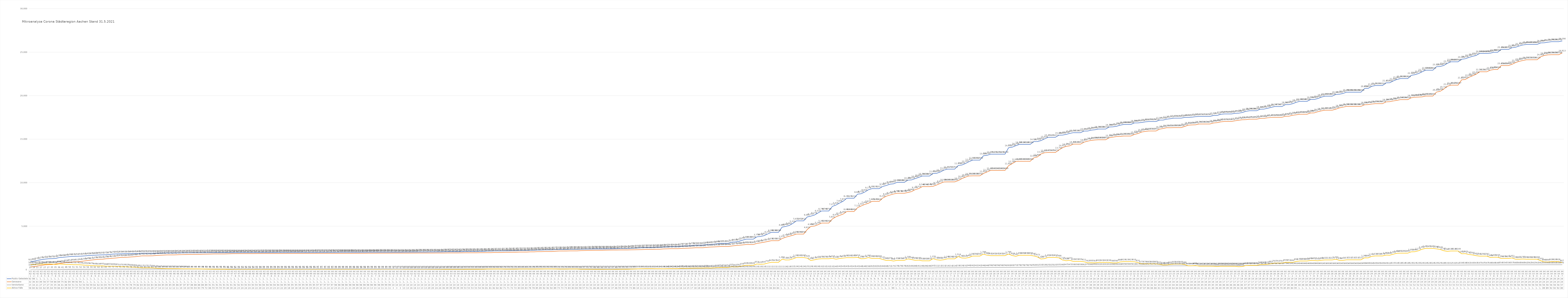
| Category | Positiv Getestete | Genesene | Verstorbene | Aktive Fälle |
|---|---|---|---|---|
| 3/31/20 | 922 | 322 | 15 | 585 |
| 4/1/20 | 980 | 364 | 16 | 600 |
| 4/2/20 | 1081 | 435 | 21 | 625 |
| 4/3/20 | 1155 | 494 | 27 | 634 |
| 4/4/20 | 1213 | 560 | 27 | 626 |
| 4/5/20 | 1259 | 578 | 27 | 654 |
| 4/6/20 | 1272 | 595 | 35 | 642 |
| 4/7/20 | 1295 | 662 | 35 | 598 |
| 4/8/20 | 1399 | 699 | 36 | 664 |
| 4/9/20 | 1426 | 755 | 41 | 630 |
| 4/10/20 | 1465 | 826 | 48 | 591 |
| 4/11/20 | 1508 | 854 | 50 | 604 |
| 4/12/20 | 1532 | 906 | 51 | 575 |
| 4/13/20 | 1547 | 922 | 51 | 574 |
| 4/14/20 | 1557 | 949 | 52 | 556 |
| 4/15/20 | 1583 | 1009 | 54 | 520 |
| 4/16/20 | 1623 | 1058 | 56 | 509 |
| 4/17/20 | 1650 | 1112 | 59 | 479 |
| 4/18/20 | 1669 | 1159 | 62 | 448 |
| 4/19/20 | 1693 | 1195 | 62 | 436 |
| 4/20/20 | 1707 | 1201 | 63 | 443 |
| 4/21/20 | 1719 | 1256 | 65 | 398 |
| 4/22/20 | 1754 | 1281 | 70 | 403 |
| 4/23/20 | 1797 | 1324 | 73 | 400 |
| 4/24/20 | 1812 | 1357 | 74 | 381 |
| 4/25/20 | 1824 | 1412 | 75 | 337 |
| 4/26/20 | 1835 | 1420 | 76 | 339 |
| 4/27/20 | 1839 | 1435 | 76 | 328 |
| 4/28/20 | 1845 | 1467 | 78 | 300 |
| 4/29/20 | 1853 | 1490 | 79 | 284 |
| 4/30/20 | 1866 | 1535 | 82 | 249 |
| 5/1/20 | 1891 | 1591 | 83 | 217 |
| 5/2/20 | 1891 | 1591 | 83 | 217 |
| 5/3/20 | 1891 | 1591 | 83 | 217 |
| 5/4/20 | 1885 | 1598 | 83 | 204 |
| 5/5/20 | 1890 | 1636 | 84 | 170 |
| 5/6/20 | 1895 | 1664 | 84 | 147 |
| 5/7/20 | 1903 | 1682 | 85 | 136 |
| 5/8/20 | 1909 | 1702 | 85 | 122 |
| 5/9/20 | 1909 | 1702 | 85 | 122 |
| 5/10/20 | 1909 | 1702 | 85 | 122 |
| 5/11/20 | 1924 | 1721 | 86 | 117 |
| 5/12/20 | 1929 | 1736 | 87 | 106 |
| 5/13/20 | 1934 | 1743 | 87 | 104 |
| 5/14/20 | 1941 | 1753 | 87 | 101 |
| 5/15/20 | 1945 | 1764 | 88 | 93 |
| 5/16/20 | 1945 | 1764 | 88 | 93 |
| 5/17/20 | 1945 | 1764 | 88 | 93 |
| 5/18/20 | 1951 | 1784 | 88 | 79 |
| 5/19/20 | 1952 | 1791 | 89 | 72 |
| 5/20/20 | 1958 | 1801 | 91 | 66 |
| 5/21/20 | 1960 | 1814 | 91 | 55 |
| 5/22/20 | 1960 | 1814 | 91 | 55 |
| 5/23/20 | 1960 | 1814 | 91 | 55 |
| 5/24/20 | 1960 | 1814 | 91 | 55 |
| 5/25/20 | 1960 | 1829 | 91 | 40 |
| 5/26/20 | 1960 | 1839 | 91 | 30 |
| 5/27/20 | 1962 | 1846 | 92 | 24 |
| 5/28/20 | 1964 | 1849 | 92 | 23 |
| 5/29/20 | 1967 | 1850 | 93 | 24 |
| 5/30/20 | 1967 | 1850 | 93 | 24 |
| 5/31/20 | 1967 | 1850 | 93 | 24 |
| 6/1/20 | 1967 | 1850 | 93 | 24 |
| 6/2/20 | 1971 | 1856 | 93 | 22 |
| 6/3/20 | 1972 | 1858 | 94 | 20 |
| 6/4/20 | 1975 | 1859 | 94 | 22 |
| 6/5/20 | 1976 | 1859 | 94 | 23 |
| 6/6/20 | 1976 | 1859 | 94 | 23 |
| 6/7/20 | 1976 | 1859 | 94 | 23 |
| 6/8/20 | 1979 | 1862 | 94 | 23 |
| 6/9/20 | 1979 | 1863 | 94 | 22 |
| 6/10/20 | 1980 | 1865 | 95 | 20 |
| 6/11/20 | 1982 | 1869 | 95 | 18 |
| 6/12/20 | 1982 | 1869 | 95 | 18 |
| 6/13/20 | 1982 | 1869 | 95 | 18 |
| 6/14/20 | 1982 | 1869 | 95 | 18 |
| 6/15/20 | 1982 | 1871 | 95 | 16 |
| 6/16/20 | 1982 | 1871 | 95 | 16 |
| 6/17/20 | 1985 | 1871 | 95 | 19 |
| 6/18/20 | 1985 | 1871 | 95 | 19 |
| 6/19/20 | 1991 | 1873 | 97 | 21 |
| 6/20/20 | 1991 | 1873 | 97 | 21 |
| 6/21/20 | 1991 | 1873 | 97 | 21 |
| 6/22/20 | 1994 | 1875 | 97 | 22 |
| 6/23/20 | 1994 | 1875 | 97 | 22 |
| 6/24/20 | 1997 | 1876 | 98 | 23 |
| 6/25/20 | 1999 | 1880 | 98 | 21 |
| 6/26/20 | 1999 | 1880 | 98 | 21 |
| 6/27/20 | 1999 | 1880 | 98 | 21 |
| 6/28/20 | 1999 | 1880 | 98 | 21 |
| 6/29/20 | 2001 | 1883 | 98 | 20 |
| 6/30/20 | 2001 | 1883 | 98 | 20 |
| 7/1/20 | 2004 | 1890 | 98 | 16 |
| 7/2/20 | 2004 | 1890 | 98 | 16 |
| 7/3/20 | 2009 | 1898 | 98 | 13 |
| 7/4/20 | 2009 | 1898 | 98 | 13 |
| 7/5/20 | 2009 | 1898 | 98 | 13 |
| 7/6/20 | 2010 | 1900 | 98 | 12 |
| 7/7/20 | 2010 | 1900 | 99 | 11 |
| 7/8/20 | 2010 | 1900 | 99 | 11 |
| 7/9/20 | 2010 | 1900 | 99 | 11 |
| 7/10/20 | 2011 | 1908 | 100 | 3 |
| 7/11/20 | 2011 | 1908 | 100 | 3 |
| 7/12/20 | 2011 | 1908 | 100 | 3 |
| 7/13/20 | 2021 | 1908 | 100 | 13 |
| 7/14/20 | 2021 | 1908 | 100 | 13 |
| 7/15/20 | 2025 | 1909 | 100 | 16 |
| 7/16/20 | 2025 | 1909 | 100 | 16 |
| 7/17/20 | 2030 | 1917 | 100 | 13 |
| 7/18/20 | 2030 | 1917 | 100 | 13 |
| 7/19/20 | 2030 | 1917 | 100 | 13 |
| 7/20/20 | 2037 | 1917 | 100 | 20 |
| 7/21/20 | 2037 | 1917 | 100 | 20 |
| 7/22/20 | 2044 | 1920 | 100 | 24 |
| 7/23/20 | 2044 | 1920 | 100 | 24 |
| 7/24/20 | 2058 | 1922 | 100 | 36 |
| 7/25/20 | 2067 | 1928 | 100 | 39 |
| 7/26/20 | 2067 | 1928 | 100 | 39 |
| 7/27/20 | 2067 | 1928 | 100 | 39 |
| 7/28/20 | 2067 | 1928 | 100 | 39 |
| 7/29/20 | 2076 | 1937 | 100 | 39 |
| 7/30/20 | 2095 | 1942 | 100 | 53 |
| 7/31/20 | 2095 | 1942 | 100 | 53 |
| 8/1/20 | 2095 | 1942 | 100 | 53 |
| 8/2/20 | 2095 | 1942 | 100 | 53 |
| 8/3/20 | 2108 | 1954 | 100 | 54 |
| 8/4/20 | 2108 | 1954 | 100 | 54 |
| 8/5/20 | 2139 | 1958 | 100 | 81 |
| 8/6/20 | 2139 | 1958 | 100 | 81 |
| 8/7/20 | 2157 | 1975 | 100 | 82 |
| 8/8/20 | 2157 | 1975 | 100 | 82 |
| 8/9/20 | 2157 | 1975 | 100 | 82 |
| 8/10/20 | 2170 | 1999 | 100 | 71 |
| 8/11/20 | 2170 | 1999 | 100 | 71 |
| 8/12/20 | 2181 | 2008 | 101 | 72 |
| 8/13/20 | 2181 | 2008 | 101 | 72 |
| 8/14/20 | 2212 | 2028 | 101 | 83 |
| 8/15/20 | 2212 | 2028 | 101 | 83 |
| 8/16/20 | 2212 | 2028 | 101 | 83 |
| 8/17/20 | 2232 | 2053 | 101 | 78 |
| 8/18/20 | 2232 | 2053 | 101 | 78 |
| 8/19/20 | 2261 | 2074 | 102 | 85 |
| 8/20/20 | 2261 | 2074 | 102 | 85 |
| 8/21/20 | 2281 | 2087 | 102 | 92 |
| 8/22/20 | 2281 | 2087 | 102 | 92 |
| 8/23/20 | 2281 | 2087 | 102 | 92 |
| 8/24/20 | 2311 | 2120 | 102 | 89 |
| 8/25/20 | 2324 | 2149 | 102 | 73 |
| 8/26/20 | 2324 | 2149 | 102 | 73 |
| 8/27/20 | 2324 | 2149 | 102 | 73 |
| 8/28/20 | 2348 | 2163 | 102 | 83 |
| 8/29/20 | 2348 | 2163 | 102 | 83 |
| 8/30/20 | 2348 | 2163 | 102 | 83 |
| 8/31/20 | 2353 | 2193 | 102 | 58 |
| 9/1/20 | 2363 | 2203 | 103 | 57 |
| 9/2/20 | 2370 | 2216 | 103 | 51 |
| 9/3/20 | 2378 | 2224 | 103 | 51 |
| 9/4/20 | 2384 | 2235 | 103 | 46 |
| 9/5/20 | 2384 | 2235 | 103 | 46 |
| 9/6/20 | 2384 | 2235 | 103 | 46 |
| 9/7/20 | 2389 | 2247 | 103 | 39 |
| 9/8/20 | 2393 | 2258 | 103 | 32 |
| 9/9/20 | 2400 | 2260 | 103 | 37 |
| 9/10/20 | 2412 | 2263 | 103 | 46 |
| 9/11/20 | 2429 | 2271 | 103 | 55 |
| 9/12/20 | 2429 | 2271 | 103 | 55 |
| 9/13/20 | 2429 | 2271 | 103 | 55 |
| 9/14/20 | 2459 | 2283 | 103 | 73 |
| 9/15/20 | 2477 | 2288 | 103 | 86 |
| 9/16/20 | 2503 | 2297 | 103 | 103 |
| 9/17/20 | 2522 | 2309 | 103 | 110 |
| 9/18/20 | 2550 | 2326 | 103 | 121 |
| 9/19/20 | 2550 | 2326 | 103 | 121 |
| 9/20/20 | 2550 | 2326 | 103 | 121 |
| 9/21/20 | 2568 | 2350 | 104 | 114 |
| 9/22/20 | 2568 | 2350 | 104 | 114 |
| 9/23/20 | 2600 | 2387 | 104 | 109 |
| 9/24/20 | 2621 | 2398 | 104 | 119 |
| 9/25/20 | 2643 | 2415 | 104 | 124 |
| 9/26/20 | 2643 | 2415 | 104 | 124 |
| 9/27/20 | 2643 | 2415 | 104 | 124 |
| 9/28/20 | 2707 | 2442 | 105 | 160 |
| 9/29/20 | 2718 | 2464 | 105 | 149 |
| 9/30/20 | 2734 | 2476 | 106 | 152 |
| 10/1/20 | 2776 | 2495 | 106 | 175 |
| 10/2/20 | 2812 | 2524 | 106 | 182 |
| 10/3/20 | 2812 | 2524 | 106 | 182 |
| 10/4/20 | 2812 | 2524 | 106 | 182 |
| 10/5/20 | 2883 | 2571 | 106 | 206 |
| 10/6/20 | 2891 | 2601 | 107 | 183 |
| 10/7/20 | 2936 | 2617 | 107 | 212 |
| 10/8/20 | 2988 | 2638 | 107 | 243 |
| 10/9/20 | 3027 | 2664 | 109 | 254 |
| 10/10/20 | 3027 | 2664 | 109 | 254 |
| 10/11/20 | 3027 | 2664 | 109 | 254 |
| 10/12/20 | 3167 | 2723 | 109 | 335 |
| 10/13/20 | 3188 | 2772 | 109 | 307 |
| 10/14/20 | 3257 | 2806 | 109 | 342 |
| 10/15/20 | 3393 | 2845 | 109 | 439 |
| 10/16/20 | 3509 | 2891 | 109 | 509 |
| 10/17/20 | 3509 | 2891 | 109 | 509 |
| 10/18/20 | 3509 | 2891 | 109 | 509 |
| 10/19/20 | 3778 | 3016 | 110 | 652 |
| 10/20/20 | 3816 | 3084 | 110 | 622 |
| 10/21/20 | 3912 | 3157 | 110 | 645 |
| 10/22/20 | 4103 | 3237 | 111 | 755 |
| 10/23/20 | 4288 | 3330 | 111 | 847 |
| 10/24/20 | 4288 | 3330 | 111 | 847 |
| 10/25/20 | 4288 | 3330 | 111 | 847 |
| 10/26/20 | 4889 | 3574 | 111 | 1204 |
| 10/27/20 | 4969 | 3734 | 116 | 1119 |
| 10/28/20 | 5082 | 3840 | 119 | 1123 |
| 10/29/20 | 5316 | 3953 | 122 | 1241 |
| 10/30/20 | 5612 | 4093 | 124 | 1395 |
| 10/31/20 | 5612 | 4093 | 124 | 1395 |
| 11/1/20 | 5612 | 4093 | 124 | 1395 |
| 11/2/20 | 6061 | 4610 | 125 | 1326 |
| 11/3/20 | 6153 | 4966 | 129 | 1058 |
| 11/4/20 | 6278 | 5013 | 130 | 1135 |
| 11/5/20 | 6519 | 5166 | 130 | 1223 |
| 11/6/20 | 6748 | 5360 | 132 | 1256 |
| 11/7/20 | 6748 | 5360 | 132 | 1256 |
| 11/8/20 | 6748 | 5360 | 132 | 1256 |
| 11/9/20 | 7273 | 5831 | 132 | 1310 |
| 11/10/20 | 7426 | 6076 | 140 | 1210 |
| 11/11/20 | 7658 | 6237 | 142 | 1279 |
| 11/12/20 | 7871 | 6394 | 143 | 1334 |
| 11/13/20 | 8211 | 6683 | 143 | 1385 |
| 11/14/20 | 8211 | 6683 | 143 | 1385 |
| 11/15/20 | 8211 | 6683 | 143 | 1385 |
| 11/16/20 | 8681 | 7124 | 143 | 1414 |
| 11/17/20 | 8728 | 7322 | 148 | 1258 |
| 11/18/20 | 8920 | 7498 | 148 | 1274 |
| 11/19/20 | 9179 | 7631 | 156 | 1392 |
| 11/20/20 | 9311 | 7849 | 162 | 1300 |
| 11/21/20 | 9311 | 7849 | 162 | 1300 |
| 11/22/20 | 9311 | 7849 | 162 | 1300 |
| 11/23/20 | 9565 | 8230 | 164 | 1171 |
| 11/24/20 | 9676 | 8447 | 168 | 1061 |
| 11/25/20 | 9827 | 8576 | 172 | 1079 |
| 11/26/20 | 9867 | 8698 | 175 | 994 |
| 11/27/20 | 10038 | 8786 | 178 | 1074 |
| 11/28/20 | 10038 | 8786 | 178 | 1074 |
| 11/29/20 | 10038 | 8786 | 178 | 1074 |
| 11/30/20 | 10289 | 8868 | 182 | 1239 |
| 12/1/20 | 10316 | 8968 | 184 | 1164 |
| 12/2/20 | 10460 | 9194 | 188 | 1078 |
| 12/3/20 | 10605 | 9314 | 191 | 1100 |
| 12/4/20 | 10764 | 9548 | 196 | 1020 |
| 12/5/20 | 10764 | 9548 | 196 | 1020 |
| 12/6/20 | 10764 | 9548 | 196 | 1020 |
| 12/7/20 | 11053 | 9586 | 197 | 1270 |
| 12/8/20 | 11080 | 9730 | 211 | 1139 |
| 12/9/20 | 11222 | 9915 | 213 | 1094 |
| 12/10/20 | 11442 | 10086 | 213 | 1143 |
| 12/11/20 | 11557 | 10095 | 214 | 1248 |
| 12/12/20 | 11557 | 10095 | 214 | 1248 |
| 12/13/20 | 11557 | 10095 | 214 | 1248 |
| 12/14/20 | 11970 | 10237 | 219 | 1514 |
| 12/15/20 | 12025 | 10461 | 219 | 1345 |
| 12/16/20 | 12197 | 10640 | 232 | 1325 |
| 12/17/20 | 12415 | 10773 | 240 | 1402 |
| 12/18/20 | 12592 | 10783 | 242 | 1567 |
| 12/19/20 | 12592 | 10783 | 242 | 1567 |
| 12/20/20 | 12592 | 10783 | 242 | 1567 |
| 12/21/20 | 13089 | 11054 | 246 | 1789 |
| 12/22/20 | 13144 | 11232 | 246 | 1666 |
| 12/23/20 | 13276 | 11409 | 256 | 1611 |
| 12/24/20 | 13276 | 11409 | 256 | 1611 |
| 12/25/20 | 13276 | 11409 | 256 | 1611 |
| 12/26/20 | 13276 | 11409 | 256 | 1611 |
| 12/27/20 | 13276 | 11409 | 256 | 1611 |
| 12/28/20 | 14012 | 11950 | 263 | 1799 |
| 12/29/20 | 14078 | 12189 | 265 | 1624 |
| 12/30/20 | 14248 | 12435 | 272 | 1541 |
| 12/31/20 | 14395 | 12460 | 276 | 1659 |
| 1/1/21 | 14395 | 12460 | 276 | 1659 |
| 1/2/21 | 14395 | 12460 | 276 | 1659 |
| 1/3/21 | 14395 | 12460 | 276 | 1659 |
| 1/4/21 | 14721 | 12848 | 292 | 1581 |
| 1/5/21 | 14723 | 12949 | 301 | 1473 |
| 1/6/21 | 14832 | 13293 | 310 | 1229 |
| 1/7/21 | 15028 | 13437 | 319 | 1272 |
| 1/8/21 | 15211 | 13473 | 325 | 1413 |
| 1/9/21 | 15211 | 13473 | 325 | 1413 |
| 1/10/21 | 15211 | 13473 | 325 | 1413 |
| 1/11/21 | 15460 | 13759 | 335 | 1366 |
| 1/12/21 | 15469 | 14015 | 340 | 1114 |
| 1/13/21 | 15548 | 14173 | 347 | 1028 |
| 1/14/21 | 15657 | 14233 | 347 | 1077 |
| 1/15/21 | 15745 | 14431 | 359 | 955 |
| 1/16/21 | 15745 | 14431 | 359 | 955 |
| 1/17/21 | 15745 | 14431 | 359 | 955 |
| 1/18/21 | 15931 | 14657 | 362 | 912 |
| 1/19/21 | 15933 | 14772 | 370 | 791 |
| 1/20/21 | 16037 | 14857 | 380 | 800 |
| 1/21/21 | 16081 | 14908 | 390 | 783 |
| 1/22/21 | 16164 | 14930 | 393 | 841 |
| 1/23/21 | 16164 | 14930 | 393 | 841 |
| 1/24/21 | 16164 | 14930 | 393 | 841 |
| 1/25/21 | 16399 | 15168 | 393 | 838 |
| 1/26/21 | 16415 | 15229 | 398 | 788 |
| 1/27/21 | 16478 | 15299 | 399 | 780 |
| 1/28/21 | 16602 | 15315 | 399 | 888 |
| 1/29/21 | 16688 | 15360 | 405 | 923 |
| 1/30/21 | 16688 | 15360 | 405 | 923 |
| 1/31/21 | 16688 | 15360 | 405 | 923 |
| 2/1/21 | 16866 | 15540 | 416 | 910 |
| 2/2/21 | 16871 | 15644 | 417 | 810 |
| 2/3/21 | 16914 | 15817 | 420 | 677 |
| 2/4/21 | 16984 | 15886 | 420 | 678 |
| 2/5/21 | 17029 | 15937 | 427 | 665 |
| 2/6/21 | 17029 | 15937 | 427 | 665 |
| 2/7/21 | 17029 | 15937 | 427 | 665 |
| 2/8/21 | 17191 | 16150 | 430 | 611 |
| 2/9/21 | 17198 | 16225 | 435 | 538 |
| 2/10/21 | 17301 | 16316 | 437 | 548 |
| 2/11/21 | 17352 | 16314 | 437 | 601 |
| 2/12/21 | 17416 | 16328 | 443 | 645 |
| 2/13/21 | 17416 | 16328 | 443 | 645 |
| 2/14/21 | 17416 | 16328 | 443 | 645 |
| 2/15/21 | 17499 | 16463 | 447 | 589 |
| 2/16/21 | 17502 | 16612 | 447 | 443 |
| 2/17/21 | 17530 | 16635 | 448 | 447 |
| 2/18/21 | 17582 | 16651 | 448 | 483 |
| 2/19/21 | 17611 | 16744 | 455 | 412 |
| 2/20/21 | 17611 | 16744 | 455 | 412 |
| 2/21/21 | 17611 | 16744 | 455 | 412 |
| 2/22/21 | 17611 | 16744 | 455 | 412 |
| 2/23/21 | 17720 | 16859 | 455 | 406 |
| 2/24/21 | 17722 | 16899 | 457 | 366 |
| 2/25/21 | 17858 | 16987 | 465 | 406 |
| 2/26/21 | 17896 | 17033 | 465 | 398 |
| 2/27/21 | 17896 | 17033 | 465 | 398 |
| 2/28/21 | 17896 | 17033 | 465 | 398 |
| 3/1/21 | 17971 | 17110 | 466 | 395 |
| 3/2/21 | 17984 | 17178 | 466 | 340 |
| 3/3/21 | 18062 | 17228 | 468 | 366 |
| 3/4/21 | 18194 | 17244 | 470 | 480 |
| 3/5/21 | 18266 | 17295 | 470 | 501 |
| 3/6/21 | 18266 | 17295 | 470 | 501 |
| 3/7/21 | 18266 | 17295 | 470 | 501 |
| 3/8/21 | 18445 | 17383 | 473 | 589 |
| 3/9/21 | 18451 | 17388 | 474 | 589 |
| 3/10/21 | 18548 | 17451 | 474 | 623 |
| 3/11/21 | 18651 | 17493 | 475 | 683 |
| 3/12/21 | 18747 | 17508 | 476 | 763 |
| 3/13/21 | 18747 | 17508 | 476 | 763 |
| 3/14/21 | 18747 | 17508 | 476 | 763 |
| 3/15/21 | 18967 | 17633 | 479 | 855 |
| 3/16/21 | 18970 | 17638 | 481 | 851 |
| 3/17/21 | 19075 | 17749 | 482 | 844 |
| 3/18/21 | 19232 | 17800 | 482 | 950 |
| 3/19/21 | 19348 | 17864 | 484 | 1000 |
| 3/20/21 | 19348 | 17864 | 484 | 1000 |
| 3/21/21 | 19348 | 17864 | 484 | 1000 |
| 3/22/21 | 19559 | 18009 | 486 | 1064 |
| 3/23/21 | 19563 | 18017 | 489 | 1057 |
| 3/24/21 | 19663 | 18151 | 490 | 1022 |
| 3/25/21 | 19832 | 18252 | 491 | 1089 |
| 3/26/21 | 19939 | 18325 | 493 | 1121 |
| 3/27/21 | 19939 | 18325 | 493 | 1121 |
| 3/28/21 | 19939 | 18325 | 493 | 1121 |
| 3/29/21 | 20141 | 18444 | 493 | 1204 |
| 3/30/21 | 20162 | 18593 | 495 | 1074 |
| 3/31/21 | 20247 | 18675 | 495 | 1077 |
| 4/1/21 | 20398 | 18766 | 495 | 1137 |
| 4/2/21 | 20398 | 18766 | 495 | 1137 |
| 4/3/21 | 20398 | 18766 | 495 | 1137 |
| 4/4/21 | 20398 | 18766 | 495 | 1137 |
| 4/5/21 | 20398 | 18766 | 495 | 1137 |
| 4/6/21 | 20818 | 18950 | 499 | 1369 |
| 4/7/21 | 20835 | 18974 | 499 | 1362 |
| 4/8/21 | 21070 | 19035 | 504 | 1531 |
| 4/9/21 | 21163 | 19079 | 505 | 1579 |
| 4/10/21 | 21163 | 19079 | 505 | 1579 |
| 4/11/21 | 21163 | 19079 | 505 | 1579 |
| 4/12/21 | 21473 | 19285 | 505 | 1683 |
| 4/13/21 | 21482 | 19309 | 510 | 1663 |
| 4/14/21 | 21688 | 19390 | 515 | 1783 |
| 4/15/21 | 21861 | 19457 | 516 | 1888 |
| 4/16/21 | 21963 | 19544 | 518 | 1901 |
| 4/17/21 | 21963 | 19544 | 518 | 1901 |
| 4/18/21 | 21963 | 19544 | 518 | 1901 |
| 4/19/21 | 22329 | 19753 | 523 | 2053 |
| 4/20/21 | 22407 | 19820 | 523 | 2064 |
| 4/21/21 | 22536 | 19838 | 523 | 2175 |
| 4/22/21 | 22736 | 19860 | 524 | 2352 |
| 4/23/21 | 22926 | 19951 | 524 | 2451 |
| 4/24/21 | 22926 | 19951 | 524 | 2451 |
| 4/25/21 | 22926 | 19951 | 524 | 2451 |
| 4/26/21 | 23325 | 20410 | 525 | 2390 |
| 4/27/21 | 23349 | 20496 | 525 | 2328 |
| 4/28/21 | 23454 | 20743 | 528 | 2183 |
| 4/29/21 | 23708 | 21070 | 531 | 2107 |
| 4/30/21 | 23886 | 21205 | 532 | 2149 |
| 5/1/21 | 23887 | 21206 | 532 | 2149 |
| 5/2/21 | 23888 | 21207 | 532 | 2149 |
| 5/3/21 | 24183 | 21817 | 534 | 1832 |
| 5/4/21 | 24236 | 21855 | 538 | 1843 |
| 5/5/21 | 24385 | 22099 | 541 | 1745 |
| 5/6/21 | 24512 | 22268 | 543 | 1701 |
| 5/7/21 | 24611 | 22456 | 543 | 1612 |
| 5/8/21 | 24849 | 22741 | 547 | 1561 |
| 5/9/21 | 24849 | 22741 | 547 | 1561 |
| 5/10/21 | 24849 | 22741 | 547 | 1561 |
| 5/11/21 | 24885 | 22930 | 549 | 1406 |
| 5/12/21 | 24988 | 23004 | 549 | 1435 |
| 5/13/21 | 24988 | 23004 | 549 | 1435 |
| 5/14/21 | 25306 | 23458 | 554 | 1294 |
| 5/15/21 | 25307 | 23459 | 554 | 1294 |
| 5/16/21 | 25308 | 23460 | 554 | 1294 |
| 5/17/21 | 25503 | 23595 | 557 | 1351 |
| 5/18/21 | 25559 | 23799 | 560 | 1200 |
| 5/19/21 | 25704 | 23943 | 560 | 1201 |
| 5/20/21 | 25820 | 24030 | 560 | 1230 |
| 5/21/21 | 25884 | 24122 | 562 | 1200 |
| 5/22/21 | 25885 | 24123 | 562 | 1200 |
| 5/23/21 | 25886 | 24124 | 562 | 1200 |
| 5/24/21 | 25887 | 24125 | 562 | 1200 |
| 5/25/21 | 26059 | 24464 | 562 | 1033 |
| 5/26/21 | 26077 | 24616 | 565 | 896 |
| 5/27/21 | 26143 | 24685 | 568 | 890 |
| 5/28/21 | 26200 | 24704 | 568 | 928 |
| 5/29/21 | 26201 | 24705 | 568 | 928 |
| 5/30/21 | 26202 | 24706 | 568 | 928 |
| 5/31/21 | 26290 | 24913 | 570 | 807 |